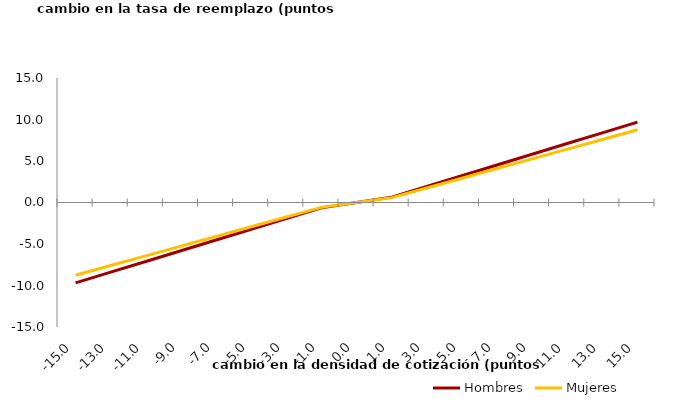
| Category | Hombres | Mujeres |
|---|---|---|
| -15.0 | -9.684 | -8.765 |
| -13.0 | -8.393 | -7.596 |
| -11.0 | -7.102 | -6.427 |
| -9.0 | -5.811 | -5.259 |
| -6.999999999999999 | -4.519 | -4.09 |
| -4.999999999999999 | -3.228 | -2.922 |
| -2.9999999999999987 | -1.937 | -1.753 |
| -0.9999999999999988 | -0.646 | -0.584 |
| 0.0 | 0 | 0 |
| 1.0000000000000013 | 0.646 | 0.584 |
| 3.0000000000000013 | 1.937 | 1.753 |
| 5.000000000000002 | 3.228 | 2.922 |
| 7.000000000000002 | 4.519 | 4.09 |
| 9.000000000000002 | 5.811 | 5.259 |
| 11.000000000000004 | 7.102 | 6.427 |
| 13.000000000000004 | 8.393 | 7.596 |
| 15.000000000000002 | 9.684 | 8.765 |